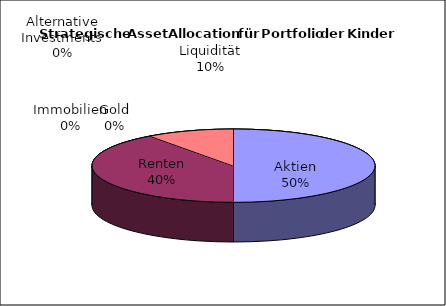
| Category | Anteil [%] |
|---|---|
| Aktien | 0.5 |
| Renten | 0.4 |
| Immobilien | 0 |
| Alternative Investments | 0 |
| Gold | 0 |
| Liquidität | 0.1 |